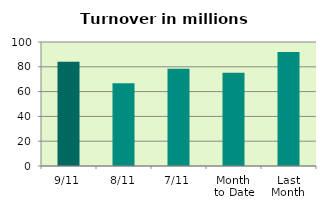
| Category | Series 0 |
|---|---|
| 9/11 | 84.067 |
| 8/11 | 66.682 |
| 7/11 | 78.398 |
| Month 
to Date | 75.28 |
| Last
Month | 91.964 |